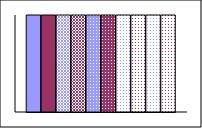
| Category | Series 1 | Series 2 | Series 3 | Series 4 | Series 5 | Series 6 | Series 7 | Series 8 | Series 9 | Series 10 |
|---|---|---|---|---|---|---|---|---|---|---|
| Point 1 | 1 | 1 | 1 | 1 | 1 | 1 | 1 | 1 | 1 | 1 |